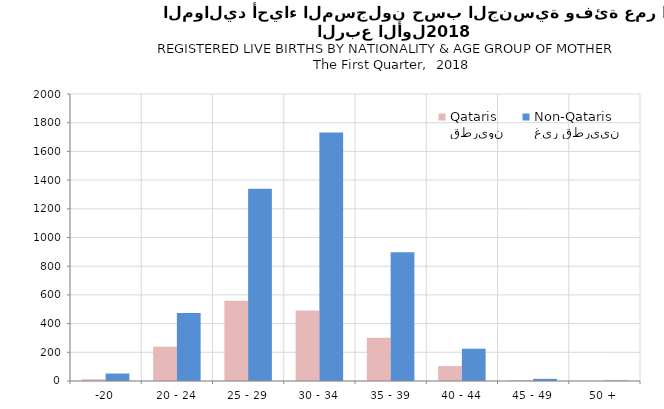
| Category | قطريون
Qataris | غير قطريين
Non-Qataris |
|---|---|---|
| -20 | 12 | 52 |
| 20 - 24 | 239 | 474 |
| 25 - 29 | 559 | 1339 |
| 30 - 34 | 491 | 1731 |
| 35 - 39 | 301 | 897 |
| 40 - 44 | 104 | 225 |
| 45 - 49 | 6 | 15 |
| 50 + | 0 | 3 |